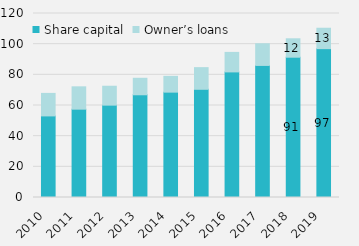
| Category | Share capital | Owner’s loans |
|---|---|---|
| 2010 | 53209.462 | 14683.355 |
| 2011 | 57608.578 | 14568.102 |
| 2012 | 60232.63 | 12332.022 |
| 2013 | 66993.372 | 10751.712 |
| 2014 | 68709.97 | 10301.015 |
| 2015 | 70572.72 | 14122.591 |
| 2016 | 81911.689 | 12721.165 |
| 2017 | 86136.94 | 14123.24 |
| 2018 | 91497.197 | 12008.666 |
| 2019 | 97081 | 13303 |